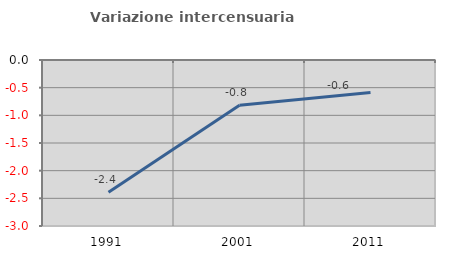
| Category | Variazione intercensuaria annua |
|---|---|
| 1991.0 | -2.39 |
| 2001.0 | -0.819 |
| 2011.0 | -0.587 |